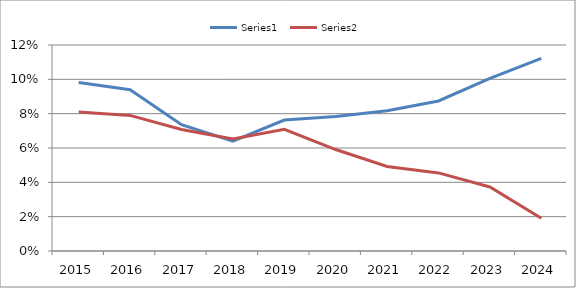
| Category | Series 0 | Series 1 |
|---|---|---|
| 2015.0 | 0.098 | 0.081 |
| 2016.0 | 0.094 | 0.079 |
| 2017.0 | 0.074 | 0.071 |
| 2018.0 | 0.064 | 0.065 |
| 2019.0 | 0.076 | 0.071 |
| 2020.0 | 0.078 | 0.059 |
| 2021.0 | 0.082 | 0.049 |
| 2022.0 | 0.087 | 0.046 |
| 2023.0 | 0.1 | 0.037 |
| 2024.0 | 0.112 | 0.019 |